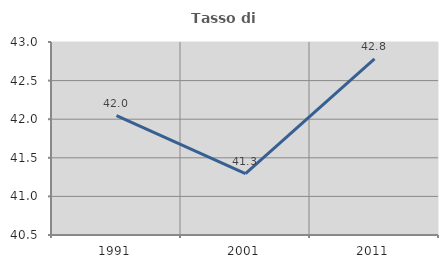
| Category | Tasso di occupazione   |
|---|---|
| 1991.0 | 42.047 |
| 2001.0 | 41.296 |
| 2011.0 | 42.781 |